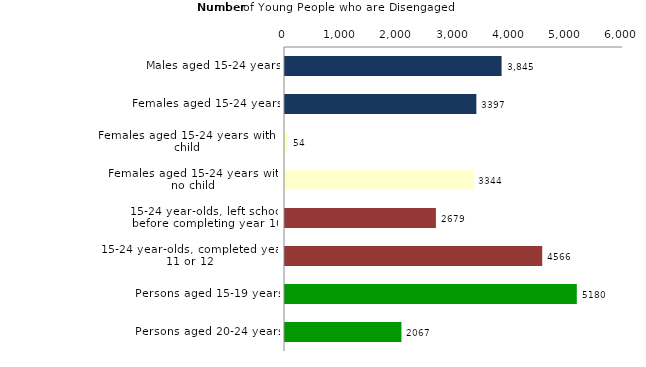
| Category | Series 0 |
|---|---|
| Males aged 15-24 years | 3845 |
| Females aged 15-24 years | 3397 |
| Females aged 15-24 years with a child | 54 |
| Females aged 15-24 years with no child | 3344 |
| 15-24 year-olds, left school before completing year 10 | 2679 |
| 15-24 year-olds, completed year 11 or 12 | 4566 |
| Persons aged 15-19 years | 5180 |
| Persons aged 20-24 years | 2067 |